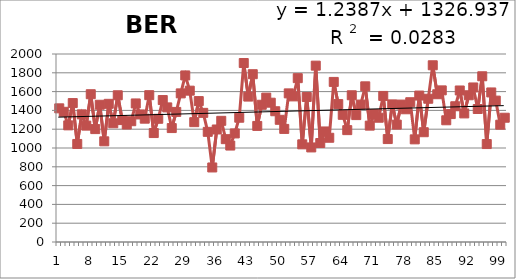
| Category | 1913-2012 |
|---|---|
| 0 | 1422 |
| 1 | 1385 |
| 2 | 1241 |
| 3 | 1478 |
| 4 | 1043 |
| 5 | 1358 |
| 6 | 1238 |
| 7 | 1572 |
| 8 | 1201 |
| 9 | 1460 |
| 10 | 1071 |
| 11 | 1470 |
| 12 | 1263 |
| 13 | 1561 |
| 14 | 1297 |
| 15 | 1250 |
| 16 | 1285 |
| 17 | 1474 |
| 18 | 1357 |
| 19 | 1312 |
| 20 | 1562 |
| 21 | 1159 |
| 22 | 1311 |
| 23 | 1510 |
| 24 | 1432 |
| 25 | 1212 |
| 26 | 1384 |
| 27 | 1581 |
| 28 | 1772 |
| 29 | 1610 |
| 30 | 1275 |
| 31 | 1499 |
| 32 | 1374 |
| 33 | 1172 |
| 34 | 793 |
| 35 | 1197 |
| 36 | 1289 |
| 37 | 1094 |
| 38 | 1026 |
| 39 | 1155 |
| 40 | 1322 |
| 41 | 1904 |
| 42 | 1547 |
| 43 | 1785 |
| 44 | 1235 |
| 45 | 1460 |
| 46 | 1536 |
| 47 | 1482 |
| 48 | 1391 |
| 49 | 1300 |
| 50 | 1203 |
| 51 | 1581 |
| 52 | 1549 |
| 53 | 1743 |
| 54 | 1039 |
| 55 | 1543 |
| 56 | 1006 |
| 57 | 1876 |
| 58 | 1053 |
| 59 | 1176 |
| 60 | 1109 |
| 61 | 1703 |
| 62 | 1467 |
| 63 | 1353 |
| 64 | 1190 |
| 65 | 1561 |
| 66 | 1350 |
| 67 | 1462 |
| 68 | 1656 |
| 69 | 1238 |
| 70 | 1362 |
| 71 | 1322 |
| 72 | 1554 |
| 73 | 1095 |
| 74 | 1464 |
| 75 | 1249 |
| 76 | 1462 |
| 77 | 1412 |
| 78 | 1487 |
| 79 | 1092 |
| 80 | 1558 |
| 81 | 1168 |
| 82 | 1524 |
| 83 | 1880 |
| 84 | 1572 |
| 85 | 1613 |
| 86 | 1295 |
| 87 | 1361 |
| 88 | 1444 |
| 89 | 1612 |
| 90 | 1368 |
| 91 | 1561 |
| 92 | 1644 |
| 93 | 1415 |
| 94 | 1763 |
| 95 | 1042 |
| 96 | 1591 |
| 97 | 1504 |
| 98 | 1248 |
| 99 | 1322 |